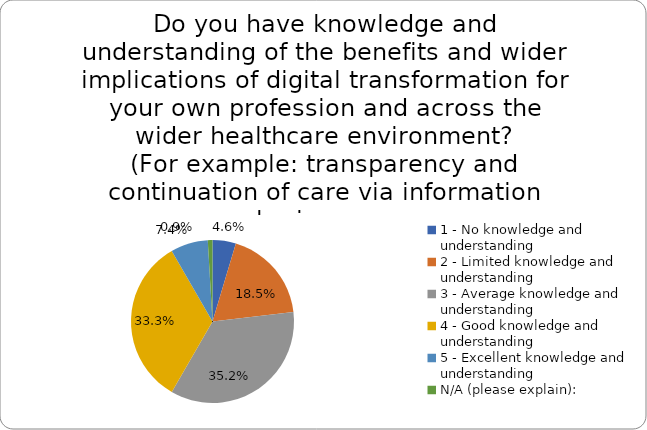
| Category | Series 0 |
|---|---|
| 1 - No knowledge and understanding | 0.046 |
| 2 - Limited knowledge and understanding | 0.185 |
| 3 - Average knowledge and understanding | 0.352 |
| 4 - Good knowledge and understanding | 0.333 |
| 5 - Excellent knowledge and understanding | 0.074 |
| N/A (please explain): | 0.009 |